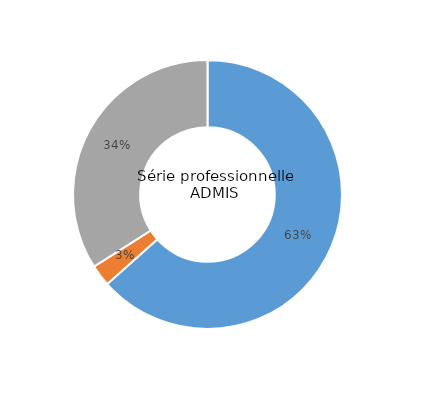
| Category | Series 0 |
|---|---|
| ... ayant validé la maîtrise du socle, et obtenu une moyenne aux épreuves terminales supérieure ou égale à 10/20 | 63.4 |
| ... n'ayant pas validé la maîtrise du socle, et obtenu une moyenne aux épreuves terminales supérieure ou égale à 10/20 | 2.6 |
| ... ayant validé la maîtrise du socle, et obtenu une moyenne aux épreuves terminales inférieure à 10/20 | 34 |
| ... n'ayant pas validé la maîtrise du socle, et obtenu une moyenne aux épreuves terminales inférieure à 10/20 | 0 |